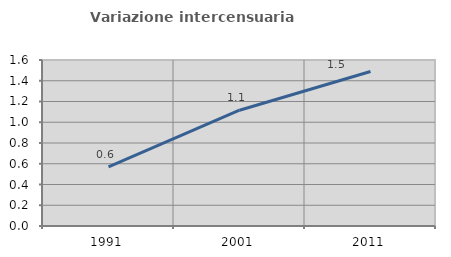
| Category | Variazione intercensuaria annua |
|---|---|
| 1991.0 | 0.57 |
| 2001.0 | 1.116 |
| 2011.0 | 1.489 |